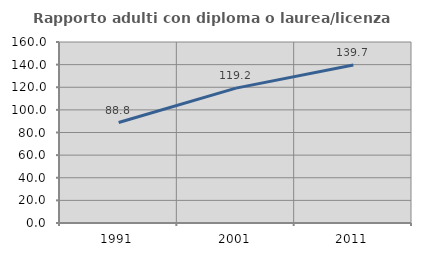
| Category | Rapporto adulti con diploma o laurea/licenza media  |
|---|---|
| 1991.0 | 88.806 |
| 2001.0 | 119.212 |
| 2011.0 | 139.655 |